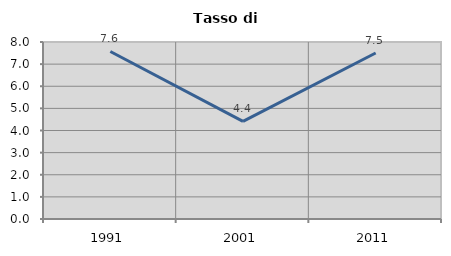
| Category | Tasso di disoccupazione   |
|---|---|
| 1991.0 | 7.571 |
| 2001.0 | 4.416 |
| 2011.0 | 7.502 |